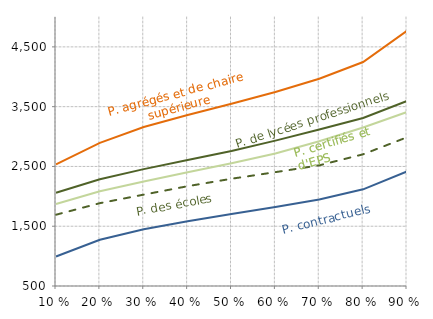
| Category | P. des écoles | P. agrégés et de chaire supérieure | P. certifiés et d'EPS | P. de lycées professionnels | P. contractuels |
|---|---|---|---|---|---|
| 0.1 | 1692.267 | 2534.215 | 1871.96 | 2060.129 | 992.541 |
| 0.2 | 1885.717 | 2894.394 | 2084.855 | 2286.58 | 1273.517 |
| 0.3 | 2028.5 | 3158.711 | 2247.894 | 2454.884 | 1449.25 |
| 0.4 | 2169.517 | 3360.149 | 2402.638 | 2606.105 | 1584.435 |
| 0.5 | 2294.183 | 3549.242 | 2552.081 | 2759.632 | 1704.759 |
| 0.6 | 2404.5 | 3746.739 | 2715.976 | 2931.574 | 1821.923 |
| 0.7 | 2518.717 | 3967.46 | 2922.573 | 3117.245 | 1948.555 |
| 0.8 | 2703.383 | 4246.446 | 3150.662 | 3310.833 | 2117.533 |
| 0.9 | 2987.933 | 4768.383 | 3409.788 | 3595.182 | 2416.27 |